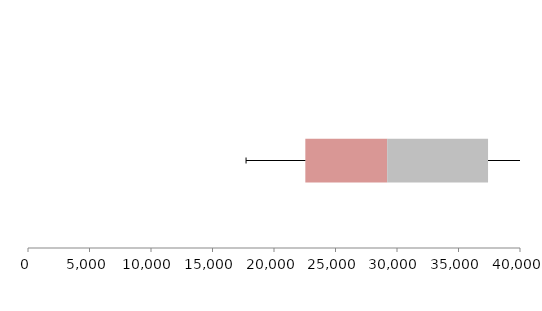
| Category | Series 1 | Series 2 | Series 3 |
|---|---|---|---|
| 0 | 22547.236 | 6654.335 | 8199.832 |